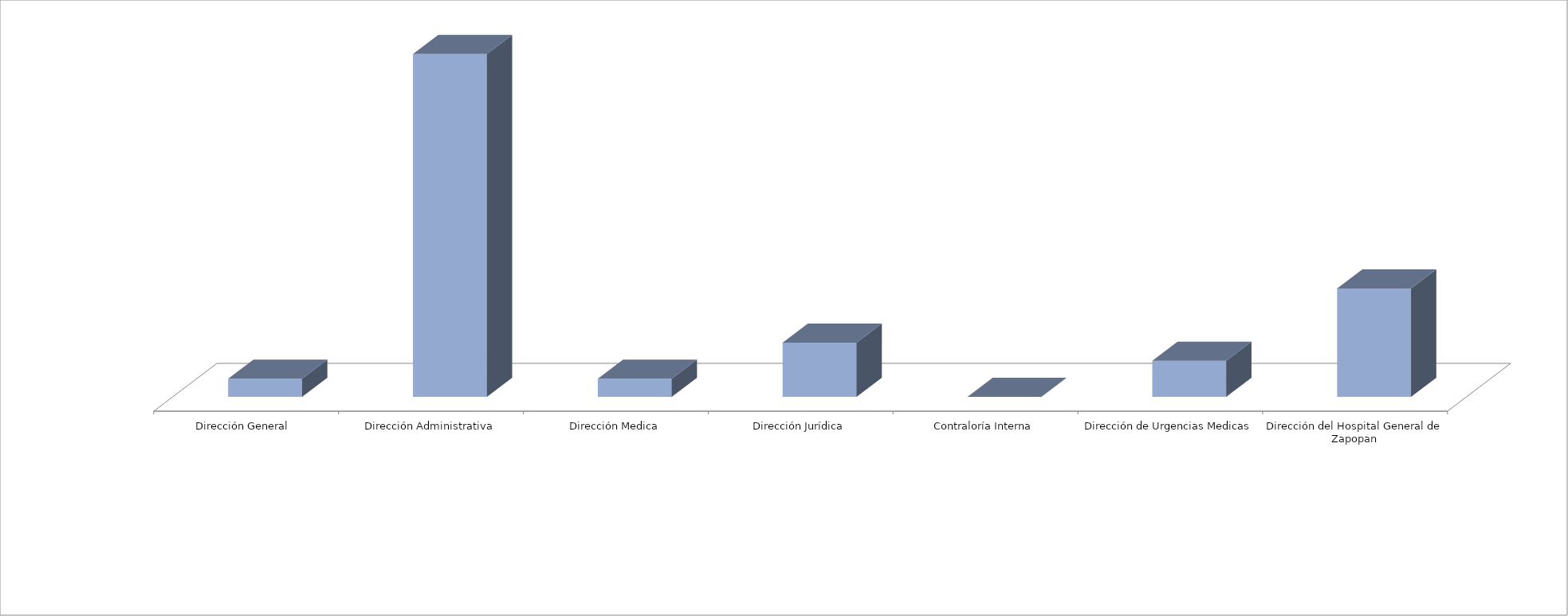
| Category | Series 0 | Series 1 |
|---|---|---|
| Dirección General  |  | 1 |
| Dirección Administrativa |  | 19 |
| Dirección Medica |  | 1 |
| Dirección Jurídica |  | 3 |
| Contraloría Interna |  | 0 |
| Dirección de Urgencias Medicas |  | 2 |
| Dirección del Hospital General de Zapopan |  | 6 |